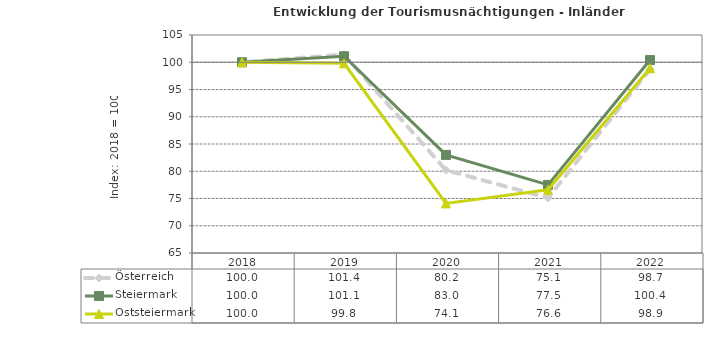
| Category | Österreich | Steiermark | Oststeiermark |
|---|---|---|---|
| 2022.0 | 98.7 | 100.4 | 98.9 |
| 2021.0 | 75.1 | 77.5 | 76.6 |
| 2020.0 | 80.2 | 83 | 74.1 |
| 2019.0 | 101.4 | 101.1 | 99.8 |
| 2018.0 | 100 | 100 | 100 |